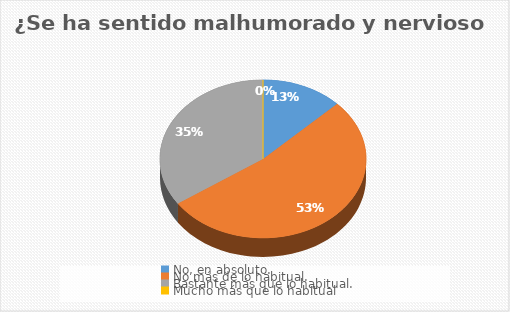
| Category | ¿ Se ha sentido malhumorado y nervioso ? |
|---|---|
| No, en absoluto. | 14 |
| No más de lo habitual. | 58 |
| Bastante más que lo habitual. | 38 |
| Mucho más que lo habitual | 0 |